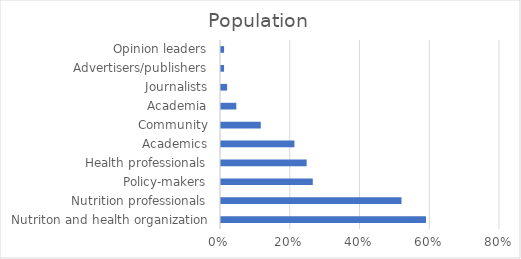
| Category | % |
|---|---|
| Nutriton and health organization | 0.588 |
| Nutrition professionals | 0.518 |
| Policy-makers | 0.263 |
| Health professionals | 0.246 |
| Academics | 0.211 |
| Community | 0.114 |
| Academia | 0.044 |
| Journalists | 0.018 |
| Advertisers/publishers | 0.009 |
| Opinion leaders | 0.009 |